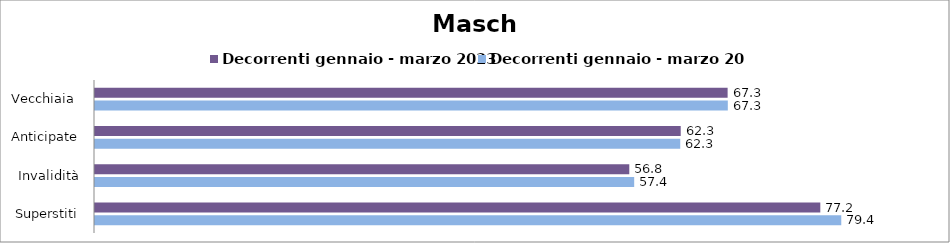
| Category | Decorrenti gennaio - marzo 2023 | Decorrenti gennaio - marzo 2024 |
|---|---|---|
| Vecchiaia  | 67.3 | 67.32 |
| Anticipate | 62.31 | 62.26 |
| Invalidità | 56.84 | 57.36 |
| Superstiti | 77.16 | 79.39 |